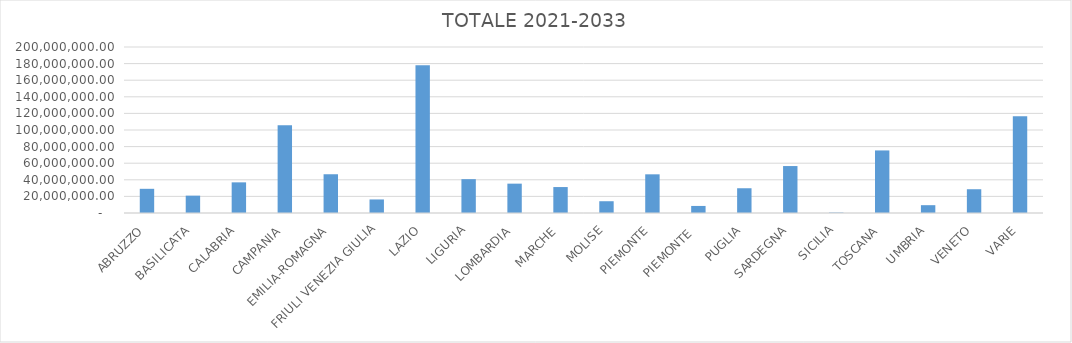
| Category | TOTALE 2021-2033 |
|---|---|
| ABRUZZO | 29140000 |
| BASILICATA | 20908500 |
| CALABRIA | 36928500 |
| CAMPANIA | 105851200 |
| EMILIA-ROMAGNA | 46693312 |
| FRIULI VENEZIA GIULIA | 16325000 |
| LAZIO | 177901445.74 |
| LIGURIA | 40774946.46 |
| LOMBARDIA | 35357051 |
| MARCHE | 31262000 |
| MOLISE | 14180024 |
| PIEMONTE | 46604600 |
| PIEMONTE  | 8500000 |
| PUGLIA | 29822000 |
| SARDEGNA | 56571488 |
| SICILIA | 478710.32 |
| TOSCANA | 75374614.88 |
| UMBRIA | 9420000 |
| VENETO | 28630356.4 |
| VARIE | 116465629.2 |